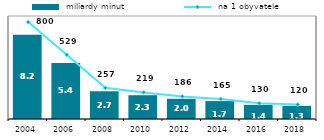
| Category |  miliardy minut |
|---|---|
| 2004.0 | 8.18 |
| 2006.0 | 5.445 |
| 2008.0 | 2.692 |
| 2010.0 | 2.31 |
| 2012.0 | 1.961 |
| 2014.0 | 1.74 |
| 2016.0 | 1.373 |
| 2018.0 | 1.275 |